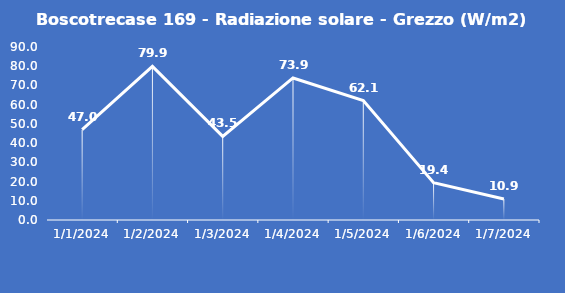
| Category | Boscotrecase 169 - Radiazione solare - Grezzo (W/m2) |
|---|---|
| 1/1/24 | 47 |
| 1/2/24 | 79.9 |
| 1/3/24 | 43.5 |
| 1/4/24 | 73.9 |
| 1/5/24 | 62.1 |
| 1/6/24 | 19.4 |
| 1/7/24 | 10.9 |